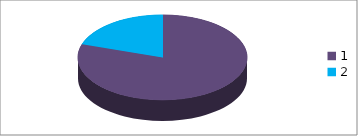
| Category | Series 0 |
|---|---|
| 0 | 8 |
| 1 | 2 |